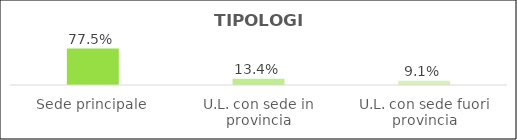
| Category | Series 0 |
|---|---|
| Sede principale | 0.775 |
| U.L. con sede in provincia | 0.134 |
| U.L. con sede fuori provincia | 0.091 |